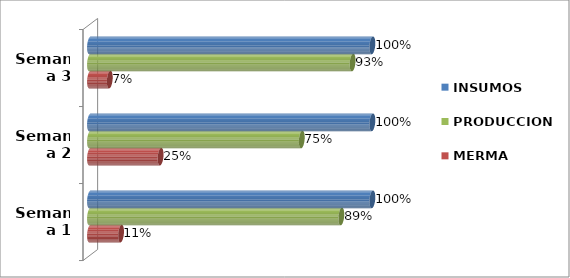
| Category | MERMA | PRODUCCION | INSUMOS |
|---|---|---|---|
| Semana 1 | 0.11 | 0.89 | 1 |
| Semana 2 | 0.25 | 0.75 | 1 |
| Semana 3 | 0.07 | 0.93 | 1 |